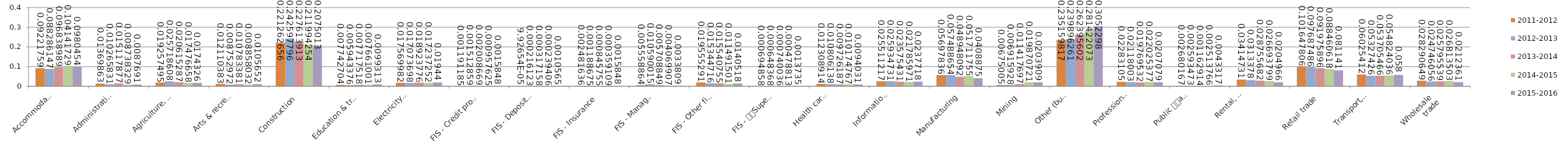
| Category | 2011-2012 | 2012-2013 | 2013-2014 | 2014-2015 | 2015-2016 |
|---|---|---|---|---|---|
| Accommodation
& food services | 0.092 | 0.088 | 0.097 | 0.104 | 0.098 |
| Administrative
& support services | 0.014 | 0.01 | 0.015 | 0.009 | 0.009 |
| Agriculture, forestry
 & fishing | 0.019 | 0.026 | 0.021 | 0.017 | 0.017 |
| Arts & recreation
 services | 0.012 | 0.009 | 0.011 | 0.009 | 0.011 |
| Construction | 0.221 | 0.243 | 0.228 | 0.212 | 0.208 |
| Education & training | 0.008 | 0.006 | 0.008 | 0.008 | 0.01 |
| Electricity, gas, 
water & waste 
services | 0.018 | 0.017 | 0.019 | 0.017 | 0.019 |
| FIS - Credit provider | 0.001 | 0.002 | 0.002 | 0.001 | 0.002 |
| FIS - Deposit taking 
institutions | 0 | 0 | 0 | 0 | 0.001 |
| FIS - Insurance | 0.002 | 0.001 | 0.001 | 0 | 0.002 |
| FIS - Managed 
investments | 0.006 | 0.011 | 0.006 | 0.004 | 0.003 |
| FIS - Other financial 
services | 0.02 | 0.015 | 0.016 | 0.011 | 0.014 |
| FIS - 
Superannuation | 0.001 | 0.001 | 0.001 | 0 | 0.001 |
| Health care
& social 
assistance | 0.012 | 0.011 | 0.01 | 0.01 | 0.009 |
| Information 
media & 
telecommunications | 0.026 | 0.026 | 0.024 | 0.022 | 0.024 |
| Manufacturing | 0.057 | 0.057 | 0.049 | 0.052 | 0.041 |
| Mining | 0.007 | 0.007 | 0.011 | 0.02 | 0.02 |
| Other (business
 & personal) 
services | 0.235 | 0.24 | 0.262 | 0.281 | 0.305 |
| Professional, 
scientific & 
technical services | 0.023 | 0.021 | 0.02 | 0.022 | 0.021 |
| Public 
administration
& safety | 0.003 | 0.003 | 0.001 | 0.003 | 0.004 |
| Rental, 
hiring & 
real estate 
services | 0.034 | 0.031 | 0.029 | 0.027 | 0.02 |
| Retail trade | 0.102 | 0.098 | 0.092 | 0.088 | 0.081 |
| Transport, 
postal & 
warehousing | 0.06 | 0.053 | 0.054 | 0.055 | 0.058 |
| Wholesale 
trade | 0.028 | 0.025 | 0.026 | 0.027 | 0.021 |